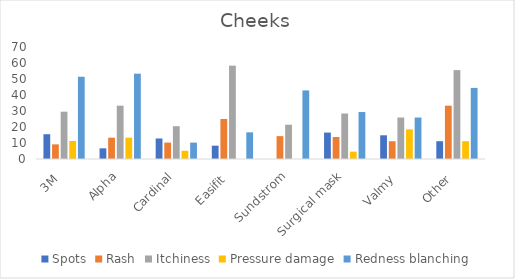
| Category | Spots | Rash | Itchiness | Pressure damage | Redness blanching |
|---|---|---|---|---|---|
| 3M  | 15.493 | 9.155 | 29.577 | 11.268 | 51.408 |
| Alpha | 6.667 | 13.333 | 33.333 | 13.333 | 53.333 |
| Cardinal | 12.821 | 10.256 | 20.513 | 5.128 | 10.256 |
| Easifit  | 8.333 | 25 | 58.333 | 0 | 16.667 |
| Sundstrom | 0 | 14.286 | 21.429 | 0 | 42.857 |
| Surgical mask | 16.514 | 13.761 | 28.44 | 4.587 | 29.358 |
| Valmy  | 14.815 | 11.111 | 25.926 | 18.519 | 25.926 |
| Other  | 11.111 | 33.333 | 55.556 | 11.111 | 44.444 |